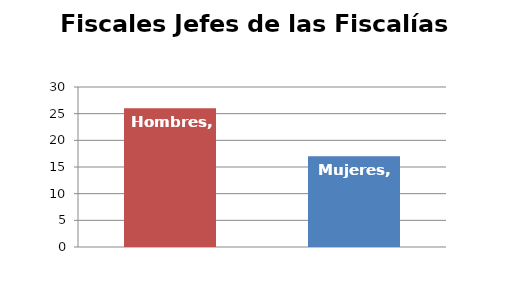
| Category | Fiscales Jefes de las Fiscalías Provinciales |
|---|---|
| Hombres | 26 |
| Mujeres | 17 |